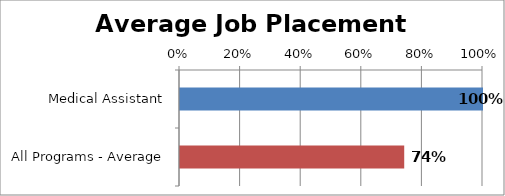
| Category | Series 0 |
|---|---|
| Medical Assistant | 1 |
| All Programs - Average | 0.74 |